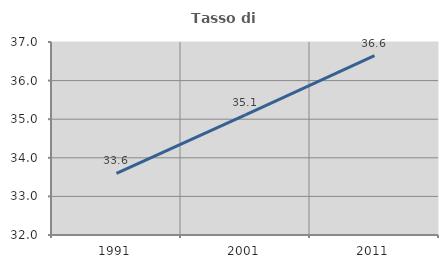
| Category | Tasso di occupazione   |
|---|---|
| 1991.0 | 33.599 |
| 2001.0 | 35.114 |
| 2011.0 | 36.647 |